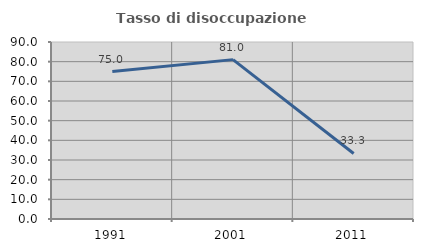
| Category | Tasso di disoccupazione giovanile  |
|---|---|
| 1991.0 | 75 |
| 2001.0 | 81.034 |
| 2011.0 | 33.333 |